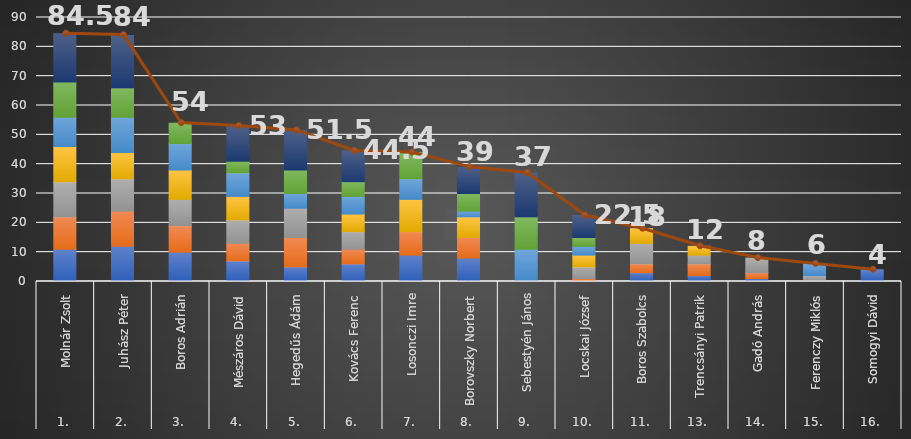
| Category | Series 0 | Series 1 | Series 2 | Series 3 | Series 4 | Series 5 | Series 6 |
|---|---|---|---|---|---|---|---|
| 0 | 11 | 11 | 12 | 12 | 10 | 12 | 16.5 |
| 1 | 12 | 12 | 11 | 9 | 12 | 10 | 18 |
| 2 | 10 | 9 | 9 | 10 | 9 | 7 | 0 |
| 3 | 7 | 6 | 8 | 8 | 8 | 4 | 12 |
| 4 | 5 | 10 | 10 | 0 | 5 | 8 | 13.5 |
| 5 | 6 | 5 | 6 | 6 | 6 | 5 | 10.5 |
| 6 | 9 | 8 | 0 | 11 | 7 | 9 | 0 |
| 7 | 8 | 7 | 0 | 7 | 2 | 6 | 9 |
| 8 | 0 | 0 | 0 | 0 | 11 | 11 | 15 |
| 9 | 0 | 1 | 4 | 4 | 3 | 3 | 7.5 |
| 10 | 3 | 3 | 7 | 5 | 0 | 0 | 0 |
| 11 | 2 | 4 | 3 | 3 | 0 | 0 | 0 |
| 12 | 1 | 2 | 5 | 0 | 0 | 0 | 0 |
| 13 | 0 | 0 | 2 | 0 | 4 | 0 | 0 |
| 14 | 4 | 0 | 0 | 0 | 0 | 0 | 0 |